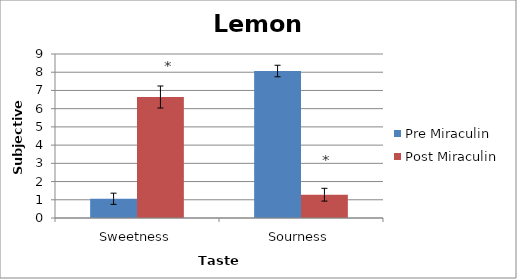
| Category | Pre Miraculin | Post Miraculin |
|---|---|---|
| Sweetness | 1.056 | 6.639 |
| Sourness | 8.067 | 1.278 |